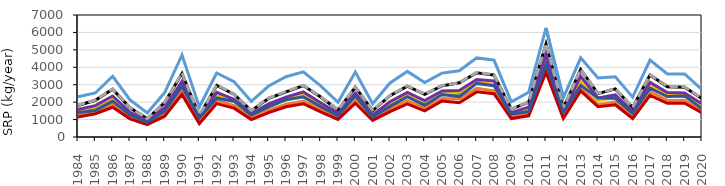
| Category | Baseline | GW | CBS | WASCOB | NRW | FP | GW + CBS | GW + CBS + WASCOB | All ACPs |
|---|---|---|---|---|---|---|---|---|---|
| 1984.0 | 1808 | 1403 | 1496 | 1583 | 2309 | 1821 | 1239 | 1146 | 1405 |
| 1985.0 | 2108 | 1701 | 1763 | 1798 | 2527 | 2118 | 1495 | 1338 | 1517 |
| 1986.0 | 2737 | 2123 | 2275 | 2351 | 3484 | 2757 | 1888 | 1705 | 2055 |
| 1987.0 | 1677 | 1324 | 1393 | 1421 | 2124 | 1688 | 1166 | 1043 | 1262 |
| 1988.0 | 1048 | 872.6 | 871.5 | 937.7 | 1383 | 1058 | 762 | 707.9 | 851.4 |
| 1989.0 | 1978 | 1507 | 1633 | 1677 | 2548 | 1995 | 1325 | 1194 | 1477 |
| 1990.0 | 3642 | 3018 | 3061 | 3191 | 4706 | 3678 | 2680 | 2446 | 2912 |
| 1991.0 | 1215 | 953.7 | 1020 | 1037 | 1722 | 1225 | 845.1 | 767.3 | 1102 |
| 1992.0 | 2961 | 2393 | 2468 | 2561 | 3673 | 2987 | 2109 | 1917 | 2224 |
| 1993.0 | 2453 | 2059 | 2070 | 2163 | 3179 | 2470 | 1807 | 1656 | 2057 |
| 1994.0 | 1506 | 1219 | 1266 | 1328 | 2043 | 1522 | 1081 | 999.3 | 1257 |
| 1995.0 | 2218 | 1759 | 1849 | 1901 | 2925 | 2235 | 1547 | 1396 | 1727 |
| 1996.0 | 2592 | 2128 | 2172 | 2286 | 3457 | 2614 | 1880 | 1736 | 2146 |
| 1997.0 | 2952 | 2311 | 2498 | 2584 | 3735 | 2972 | 2066 | 1909 | 2303 |
| 1998.0 | 2297 | 1790 | 1915 | 1968 | 2935 | 2315 | 1585 | 1436 | 1743 |
| 1999.0 | 1546 | 1246 | 1287 | 1357 | 1987 | 1559 | 1089 | 1007 | 1232 |
| 2000.0 | 2856 | 2364 | 2398 | 2524 | 3724 | 2884 | 2097 | 1936 | 2363 |
| 2001.0 | 1514 | 1238 | 1266 | 1271 | 1909 | 1529 | 1081 | 949.6 | 1144 |
| 2002.0 | 2368 | 1826 | 1953 | 2023 | 3103 | 2386 | 1615 | 1454 | 1758 |
| 2003.0 | 2915 | 2374 | 2425 | 2554 | 3764 | 2940 | 2084 | 1903 | 2315 |
| 2004.0 | 2451 | 1872 | 2041 | 2092 | 3130 | 2458 | 1670 | 1504 | 1820 |
| 2005.0 | 2933 | 2513 | 2474 | 2639 | 3666 | 2952 | 2213 | 2062 | 2433 |
| 2006.0 | 3111 | 2461 | 2599 | 2672 | 3802 | 3112 | 2179 | 1968 | 2312 |
| 2007.0 | 3690 | 3161 | 3134 | 3302 | 4538 | 3710 | 2791 | 2589 | 3075 |
| 2008.0 | 3555 | 2982 | 3002 | 3216 | 4411 | 3579 | 2649 | 2487 | 2941 |
| 2009.0 | 1597 | 1314 | 1337 | 1400 | 2015 | 1607 | 1154 | 1058 | 1313 |
| 2010.0 | 2001 | 1526 | 1642 | 1715 | 2562 | 2015 | 1352 | 1215 | 1458 |
| 2011.0 | 5332 | 4500 | 4554 | 4742 | 6263 | 5355 | 4022 | 3715 | 4189 |
| 2012.0 | 1651 | 1323 | 1380 | 1438 | 2247 | 1668 | 1169 | 1063 | 1407 |
| 2013.0 | 3869 | 3181 | 3277 | 3488 | 4541 | 3882 | 2822 | 2648 | 2963 |
| 2014.0 | 2490 | 2098 | 2102 | 2242 | 3381 | 2507 | 1861 | 1737 | 2232 |
| 2015.0 | 2760 | 2275 | 2316 | 2413 | 3453 | 2779 | 2013 | 1847 | 2218 |
| 2016.0 | 1692 | 1325 | 1404 | 1455 | 2288 | 1707 | 1171 | 1059 | 1360 |
| 2017.0 | 3558 | 2942 | 2990 | 3136 | 4410 | 3575 | 2596 | 2383 | 2800 |
| 2018.0 | 2889 | 2372 | 2429 | 2551 | 3616 | 2907 | 2101 | 1935 | 2325 |
| 2019.0 | 2859 | 2360 | 2428 | 2522 | 3615 | 2875 | 2106 | 1943 | 2358 |
| 2020.0 | 2202 | 1736 | 1836 | 1896 | 2717 | 2214 | 1539 | 1389 | 1621 |